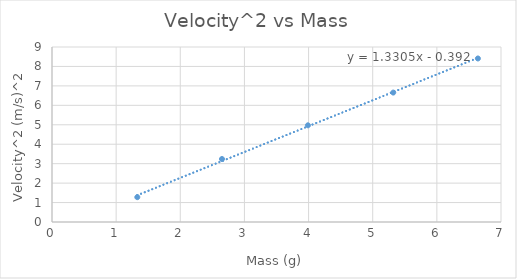
| Category | Velocity^2 |
|---|---|
| 1.33 | 1.277 |
| 2.65 | 3.24 |
| 3.99 | 4.973 |
| 5.32 | 6.656 |
| 6.64 | 8.41 |